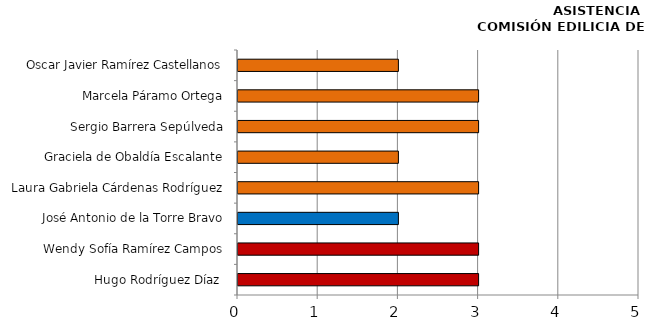
| Category | Series 0 |
|---|---|
| Hugo Rodríguez Díaz  | 3 |
| Wendy Sofía Ramírez Campos | 3 |
| José Antonio de la Torre Bravo | 2 |
| Laura Gabriela Cárdenas Rodríguez | 3 |
| Graciela de Obaldía Escalante | 2 |
| Sergio Barrera Sepúlveda | 3 |
| Marcela Páramo Ortega | 3 |
| Oscar Javier Ramírez Castellanos | 2 |